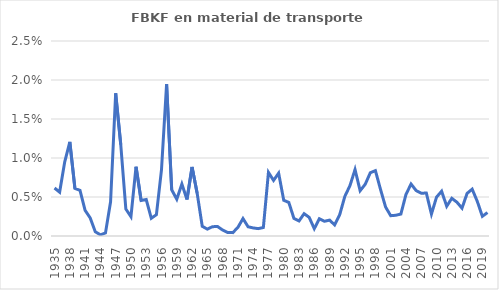
| Category | Importada |
|---|---|
| 1935.0 | 0.006 |
| 1936.0 | 0.006 |
| 1937.0 | 0.01 |
| 1938.0 | 0.012 |
| 1939.0 | 0.006 |
| 1940.0 | 0.006 |
| 1941.0 | 0.003 |
| 1942.0 | 0.002 |
| 1943.0 | 0.001 |
| 1944.0 | 0 |
| 1945.0 | 0 |
| 1946.0 | 0.004 |
| 1947.0 | 0.018 |
| 1948.0 | 0.012 |
| 1949.0 | 0.003 |
| 1950.0 | 0.002 |
| 1951.0 | 0.009 |
| 1952.0 | 0.005 |
| 1953.0 | 0.005 |
| 1954.0 | 0.002 |
| 1955.0 | 0.003 |
| 1956.0 | 0.009 |
| 1957.0 | 0.019 |
| 1958.0 | 0.006 |
| 1959.0 | 0.005 |
| 1960.0 | 0.007 |
| 1961.0 | 0.005 |
| 1962.0 | 0.009 |
| 1963.0 | 0.005 |
| 1964.0 | 0.001 |
| 1965.0 | 0.001 |
| 1966.0 | 0.001 |
| 1967.0 | 0.001 |
| 1968.0 | 0.001 |
| 1969.0 | 0 |
| 1970.0 | 0 |
| 1971.0 | 0.001 |
| 1972.0 | 0.002 |
| 1973.0 | 0.001 |
| 1974.0 | 0.001 |
| 1975.0 | 0.001 |
| 1976.0 | 0.001 |
| 1977.0 | 0.008 |
| 1978.0 | 0.007 |
| 1979.0 | 0.008 |
| 1980.0 | 0.005 |
| 1981.0 | 0.004 |
| 1982.0 | 0.002 |
| 1983.0 | 0.002 |
| 1984.0 | 0.003 |
| 1985.0 | 0.002 |
| 1986.0 | 0.001 |
| 1987.0 | 0.002 |
| 1988.0 | 0.002 |
| 1989.0 | 0.002 |
| 1990.0 | 0.001 |
| 1991.0 | 0.003 |
| 1992.0 | 0.005 |
| 1993.0 | 0.006 |
| 1994.0 | 0.009 |
| 1995.0 | 0.006 |
| 1996.0 | 0.007 |
| 1997.0 | 0.008 |
| 1998.0 | 0.008 |
| 1999.0 | 0.006 |
| 2000.0 | 0.004 |
| 2001.0 | 0.003 |
| 2002.0 | 0.003 |
| 2003.0 | 0.003 |
| 2004.0 | 0.005 |
| 2005.0 | 0.007 |
| 2006.0 | 0.006 |
| 2007.0 | 0.005 |
| 2008.0 | 0.006 |
| 2009.0 | 0.003 |
| 2010.0 | 0.005 |
| 2011.0 | 0.006 |
| 2012.0 | 0.004 |
| 2013.0 | 0.005 |
| 2014.0 | 0.004 |
| 2015.0 | 0.004 |
| 2016.0 | 0.005 |
| 2017.0 | 0.006 |
| 2018.0 | 0.004 |
| 2019.0 | 0.003 |
| 2020.0 | 0.003 |